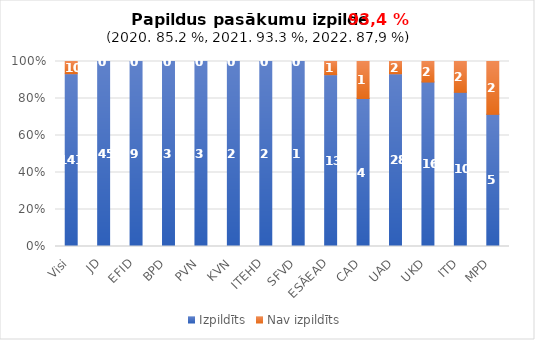
| Category | Izpildīts | Nav izpildīts |
|---|---|---|
| Visi | 141 | 10 |
| JD | 45 | 0 |
| EFID | 9 | 0 |
| BPD | 3 | 0 |
| PVN | 3 | 0 |
| KVN | 2 | 0 |
| ITEHD | 2 | 0 |
| SFVD | 1 | 0 |
| ESĀEAD | 13 | 1 |
| CAD | 4 | 1 |
| UAD | 28 | 2 |
| UKD | 16 | 2 |
| ITD | 10 | 2 |
| MPD | 5 | 2 |